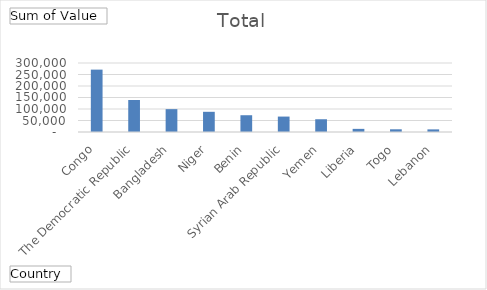
| Category | Total |
|---|---|
| Congo, The Democratic Republic | 271200 |
| Bangladesh | 139227.63 |
| Niger | 99388 |
| Benin | 87800 |
| Syrian Arab Republic | 72930 |
| Yemen | 67062 |
| Liberia | 55465.93 |
| Togo | 13620 |
| Lebanon | 11760 |
| Trinidad and Tobago | 11389.55 |